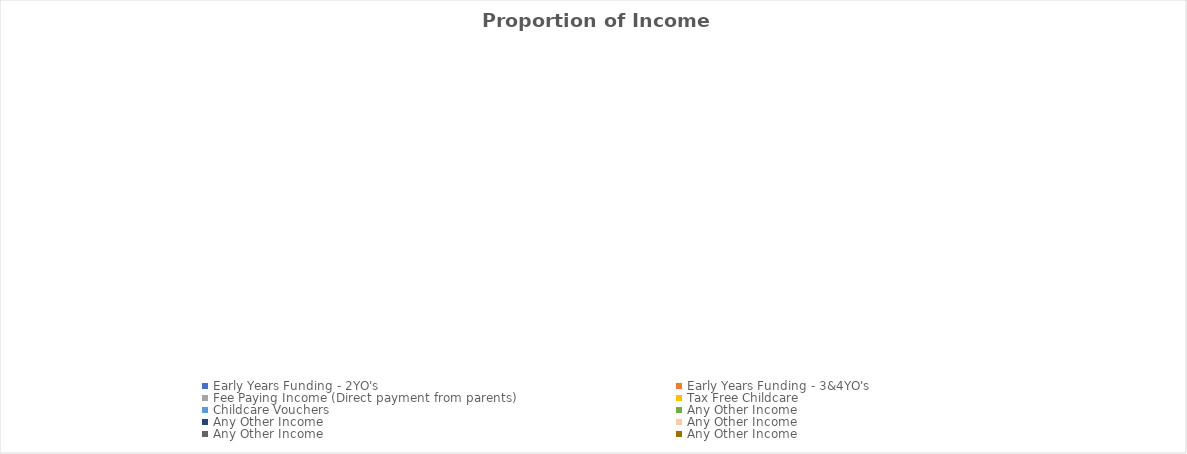
| Category | Series 0 |
|---|---|
| Early Years Funding - 2YO's | 0 |
| Early Years Funding - 3&4YO's | 0 |
| Fee Paying Income (Direct payment from parents) | 0 |
| Tax Free Childcare  | 0 |
| Childcare Vouchers | 0 |
| Any Other Income  | 0 |
| Any Other Income  | 0 |
| Any Other Income  | 0 |
| Any Other Income  | 0 |
| Any Other Income  | 0 |